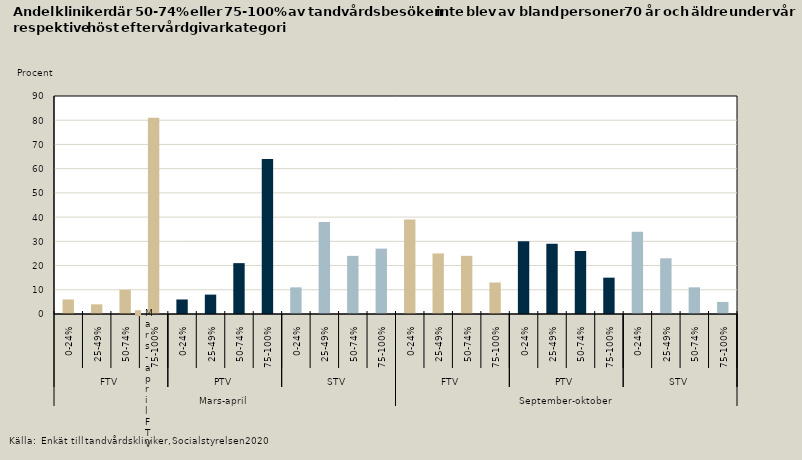
| Category | 70 år och äldre |
|---|---|
| 0 | 6 |
| 1 | 4 |
| 2 | 10 |
| 3 | 81 |
| 4 | 6 |
| 5 | 8 |
| 6 | 21 |
| 7 | 64 |
| 8 | 11 |
| 9 | 38 |
| 10 | 24 |
| 11 | 27 |
| 12 | 39 |
| 13 | 25 |
| 14 | 24 |
| 15 | 13 |
| 16 | 30 |
| 17 | 29 |
| 18 | 26 |
| 19 | 15 |
| 20 | 34 |
| 21 | 23 |
| 22 | 11 |
| 23 | 5 |